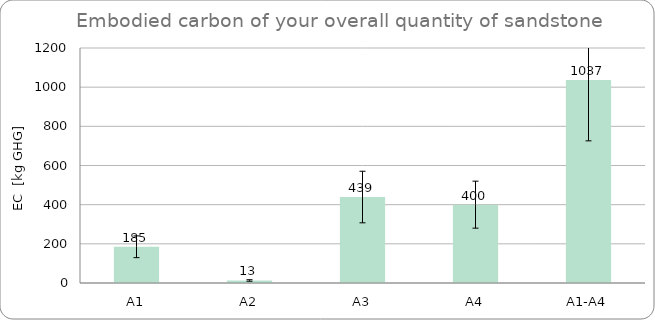
| Category | Series 0 |
|---|---|
| A1 | 185 |
| A2 | 12.9 |
| A3 | 439 |
| A4 | 400 |
| A1-A4 | 1036.9 |